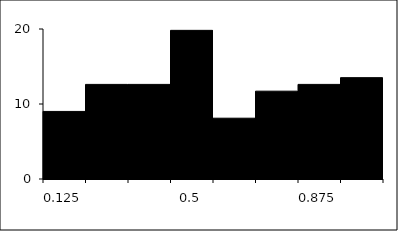
| Category | Series 1 |
|---|---|
| 0.125 | 9.009 |
| 0.25 | 12.613 |
| 0.375 | 12.613 |
| 0.5 | 19.82 |
| 0.625 | 8.108 |
| 0.75 | 11.712 |
| 0.875 | 12.613 |
| 1.0 | 13.514 |